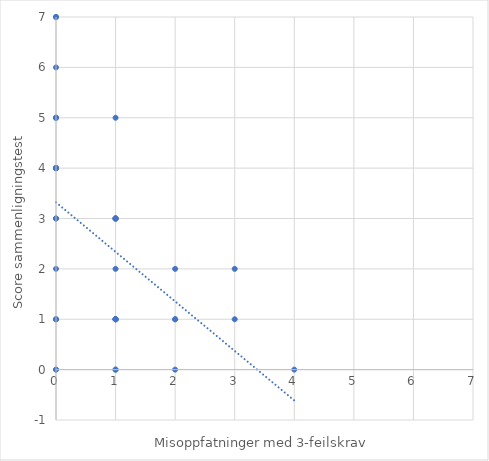
| Category | Series 0 |
|---|---|
| 0.0 | 2 |
| 1.0 | 1 |
| 3.0 | 2 |
| 1.0 | 1 |
| 0.0 | 7 |
| 4.0 | 0 |
| 0.0 | 6 |
| 0.0 | 3 |
| 0.0 | 7 |
| 0.0 | 5 |
| 0.0 | 5 |
| 1.0 | 2 |
| 0.0 | 4 |
| 0.0 | 5 |
| 2.0 | 1 |
| 1.0 | 1 |
| 0.0 | 4 |
| 1.0 | 3 |
| 2.0 | 1 |
| 0.0 | 5 |
| 0.0 | 1 |
| 1.0 | 3 |
| 0.0 | 4 |
| 0.0 | 4 |
| 1.0 | 5 |
| 1.0 | 1 |
| 1.0 | 3 |
| 0.0 | 4 |
| 3.0 | 1 |
| 0.0 | 1 |
| 0.0 | 0 |
| 2.0 | 2 |
| 0.0 | 0 |
| 1.0 | 0 |
| 0.0 | 1 |
| 2.0 | 0 |
| 1.0 | 0 |
| 1.0 | 3 |
| 0.0 | 3 |
| 1.0 | 1 |
| 0.0 | 4 |
| 0.0 | 3 |